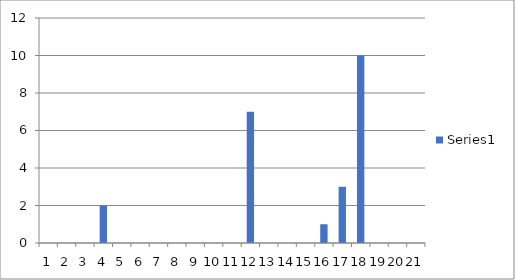
| Category | Series 0 |
|---|---|
| 0 | 0 |
| 1 | 0 |
| 2 | 0 |
| 3 | 2 |
| 4 | 0 |
| 5 | 0 |
| 6 | 0 |
| 7 | 0 |
| 8 | 0 |
| 9 | 0 |
| 10 | 0 |
| 11 | 7 |
| 12 | 0 |
| 13 | 0 |
| 14 | 0 |
| 15 | 1 |
| 16 | 3 |
| 17 | 10 |
| 18 | 0 |
| 19 | 0 |
| 20 | 0 |